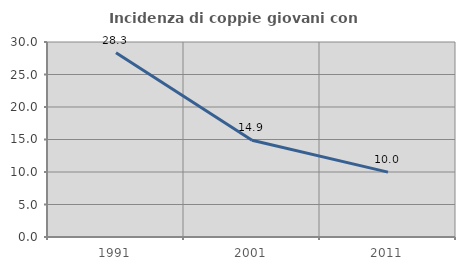
| Category | Incidenza di coppie giovani con figli |
|---|---|
| 1991.0 | 28.331 |
| 2001.0 | 14.897 |
| 2011.0 | 9.975 |